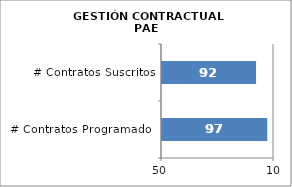
| Category | Series 0 |
|---|---|
| # Contratos Programados | 97 |
| # Contratos Suscritos | 92 |